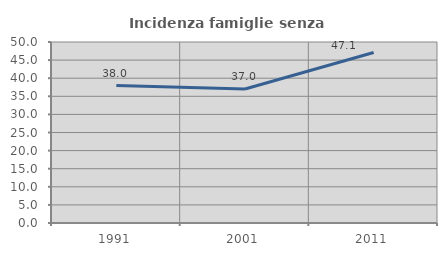
| Category | Incidenza famiglie senza nuclei |
|---|---|
| 1991.0 | 37.978 |
| 2001.0 | 37.028 |
| 2011.0 | 47.115 |